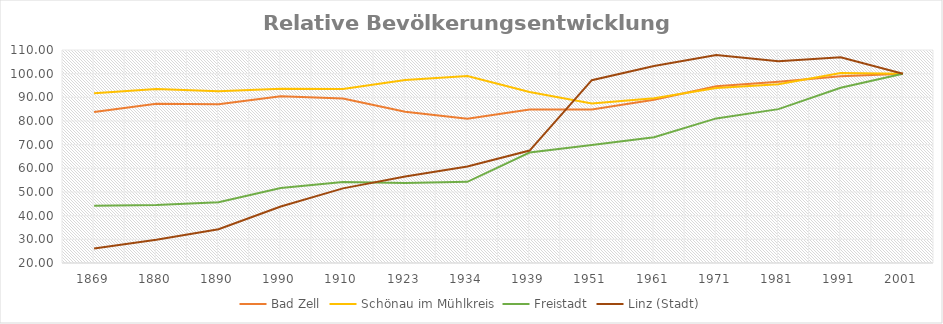
| Category | Bad Zell | Schönau im Mühlkreis | Freistadt | Linz (Stadt) |
|---|---|---|---|---|
| 1869.0 | 83.837 | 91.694 | 44.24 | 26.139 |
| 1880.0 | 87.297 | 93.509 | 44.485 | 29.791 |
| 1890.0 | 87.113 | 92.574 | 45.709 | 34.278 |
| 1990.0 | 90.427 | 93.674 | 51.68 | 43.897 |
| 1910.0 | 89.507 | 93.509 | 54.236 | 51.531 |
| 1923.0 | 83.947 | 97.36 | 53.774 | 56.593 |
| 1934.0 | 80.965 | 99.01 | 54.291 | 60.74 |
| 1939.0 | 84.867 | 92.244 | 66.68 | 67.501 |
| 1951.0 | 84.867 | 87.404 | 69.849 | 97.259 |
| 1961.0 | 88.991 | 89.604 | 73.099 | 103.207 |
| 1971.0 | 94.661 | 93.949 | 81.096 | 107.899 |
| 1981.0 | 96.576 | 95.49 | 85.013 | 105.277 |
| 1991.0 | 98.932 | 100.275 | 94.07 | 106.928 |
| 2001.0 | 100 | 100 | 100 | 100 |